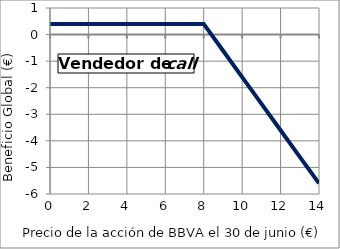
| Category | Comprador |
|---|---|
| 0.0 | 0.4 |
| 1.0 | 0.4 |
| 2.0 | 0.4 |
| 3.0 | 0.4 |
| 4.0 | 0.4 |
| 5.0 | 0.4 |
| 6.0 | 0.4 |
| 7.0 | 0.4 |
| 8.0 | 0.4 |
| 9.0 | -0.6 |
| 10.0 | -1.6 |
| 11.0 | -2.6 |
| 12.0 | -3.6 |
| 13.0 | -4.6 |
| 14.0 | -5.6 |